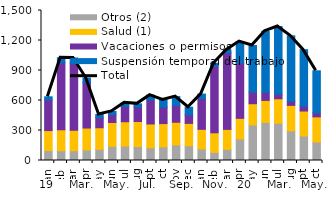
| Category | Otros (2) | Salud (1) | Vacaciones o permisos | Suspensión temporal del trabajo |
|---|---|---|---|---|
| 2019-01-01 | 98437.507 | 200896.518 | 307190.632 | 30559.584 |
| 2019-02-01 | 97515.145 | 209583.027 | 670014.597 | 49782.651 |
| 2019-03-01 | 97420.813 | 204938.732 | 672328.529 | 50555.546 |
| 2019-04-01 | 105947.258 | 218630.484 | 454805.681 | 45097.801 |
| 2019-05-01 | 111836.143 | 215653.062 | 101615.437 | 31057.802 |
| 2019-06-01 | 141611.085 | 238459.357 | 79759.205 | 31351.868 |
| 2019-07-01 | 143775.404 | 243695.378 | 153970.384 | 34791.356 |
| 2019-08-01 | 139645.325 | 250344.124 | 145929.556 | 30503.761 |
| 2019-09-01 | 126788.477 | 238471.094 | 240123.485 | 47762.594 |
| 2019-10-01 | 136155.222 | 233216.897 | 165241.671 | 71631.436 |
| 2019-11-01 | 156003.954 | 226207.442 | 169541.174 | 87140.138 |
| 2019-12-01 | 147360.649 | 223949.995 | 85507.38 | 76022.762 |
| 2020-01-01 | 115103.197 | 196553.833 | 308810.676 | 43677.605 |
| 2020-02-01 | 80326.604 | 196554.691 | 666192.987 | 29293.495 |
| 2020-03-01 | 111491.895 | 199650.941 | 764189.708 | 29992.723 |
| 2020-04-01 | 214401.678 | 207484.891 | 553669.95 | 213745.47 |
| 2020-05-01 | 355393.182 | 212360.153 | 115246.408 | 466440.666 |
| 2020-06-01 | 379928.015 | 220812.476 | 80178.92 | 612061.912 |
| 2020-07-01 | 373439.124 | 243835.204 | 45672.638 | 677199.636 |
| 2020-08-01 | 296449.337 | 254758.907 | 40242.387 | 655354.611 |
| 2020-09-01 | 244819.317 | 249935.364 | 47834.375 | 565634.784 |
| 2020-10-01 | 184662.617 | 251615.517 | 39274.391 | 421335.946 |